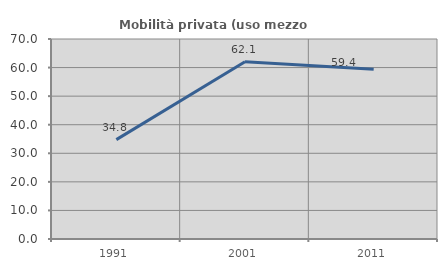
| Category | Mobilità privata (uso mezzo privato) |
|---|---|
| 1991.0 | 34.783 |
| 2001.0 | 62.069 |
| 2011.0 | 59.375 |